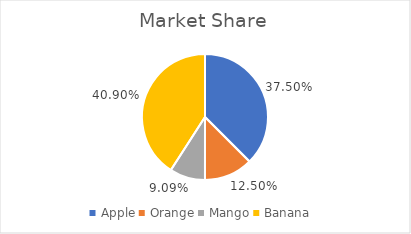
| Category | Market Share |
|---|---|
| Apple | 0.375 |
| Orange | 0.125 |
| Mango | 0.091 |
| Banana | 0.409 |